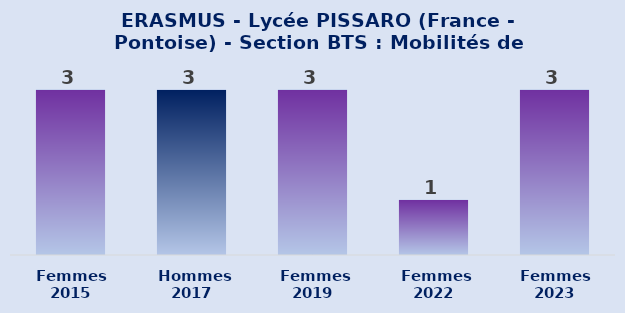
| Category | ERASMUS - Lycée PISSARO (France - Pontoise) - Section BTS : Nombre de mobilités par sexe |
|---|---|
| Femmes
2015 | 3 |
|  Hommes
2017 | 3 |
|  Femmes
2019 | 3 |
|  Femmes
2022 | 1 |
| Femmes
2023 | 3 |